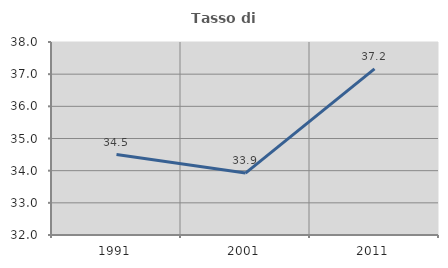
| Category | Tasso di occupazione   |
|---|---|
| 1991.0 | 34.501 |
| 2001.0 | 33.925 |
| 2011.0 | 37.166 |